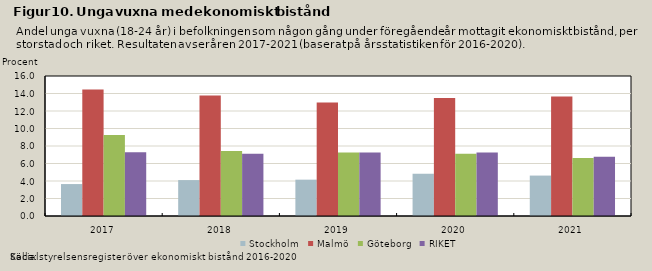
| Category | Stockholm | Malmö | Göteborg | RIKET |
|---|---|---|---|---|
| 2017.0 | 3.651 | 14.443 | 9.245 | 7.3 |
| 2018.0 | 4.105 | 13.777 | 7.424 | 7.119 |
| 2019.0 | 4.153 | 12.969 | 7.264 | 7.269 |
| 2020.0 | 4.833 | 13.499 | 7.123 | 7.262 |
| 2021.0 | 4.62 | 13.646 | 6.621 | 6.765 |